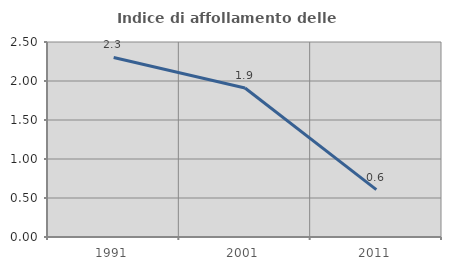
| Category | Indice di affollamento delle abitazioni  |
|---|---|
| 1991.0 | 2.302 |
| 2001.0 | 1.911 |
| 2011.0 | 0.607 |